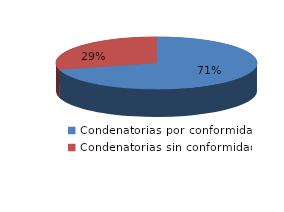
| Category | Series 0 |
|---|---|
| 0 | 150 |
| 1 | 62 |